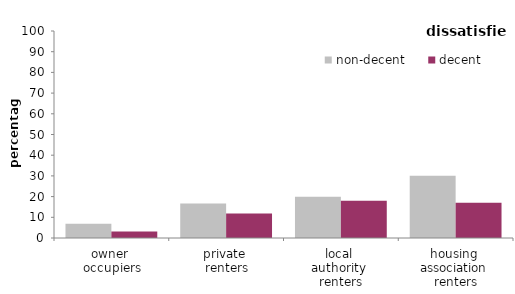
| Category | non-decent | decent |
|---|---|---|
| owner 
occupiers | 6.888 | 3.188 |
| private 
renters | 16.671 | 11.882 |
| local 
authority 
renters | 19.912 | 18.033 |
| housing 
association 
renters | 30.071 | 16.975 |